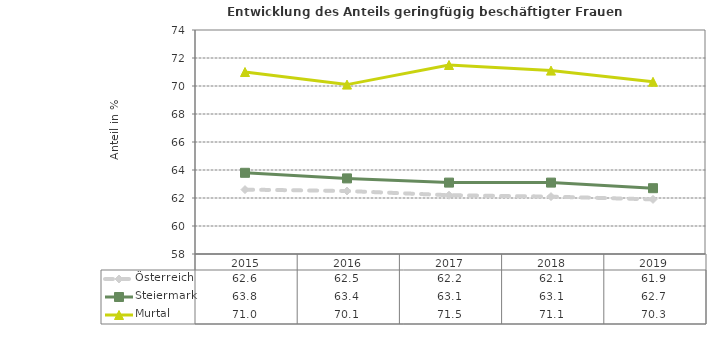
| Category | Österreich | Steiermark | Murtal |
|---|---|---|---|
| 2019.0 | 61.9 | 62.7 | 70.3 |
| 2018.0 | 62.1 | 63.1 | 71.1 |
| 2017.0 | 62.2 | 63.1 | 71.5 |
| 2016.0 | 62.5 | 63.4 | 70.1 |
| 2015.0 | 62.6 | 63.8 | 71 |